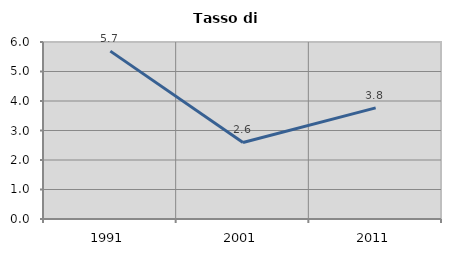
| Category | Tasso di disoccupazione   |
|---|---|
| 1991.0 | 5.69 |
| 2001.0 | 2.594 |
| 2011.0 | 3.766 |